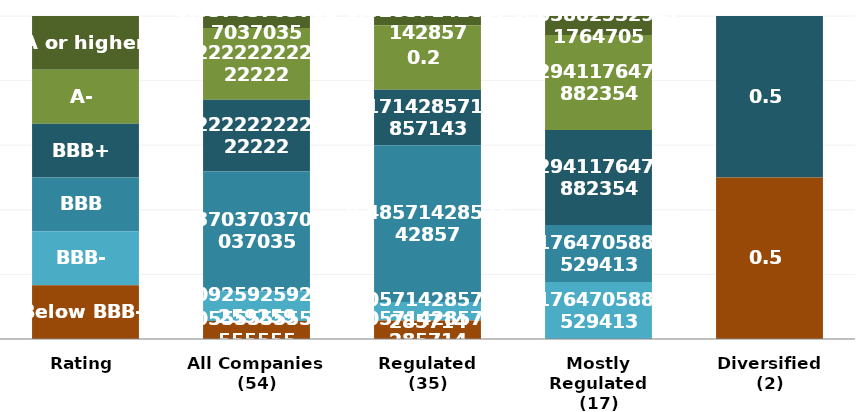
| Category | A or higher | A- | BBB+ | BBB | BBB- | Below BBB- |
|---|---|---|---|---|---|---|
| Rating | 1 | 1 | 1 | 1 | 1 | 1 |
| All Companies
(54) | 2 | 12 | 12 | 20 | 5 | 3 |
| Regulated
(35) | 1 | 7 | 6 | 17 | 2 | 2 |
| Mostly Regulated
(17) | 1 | 5 | 5 | 3 | 3 | 0 |
| Diversified
(2) | 0 | 0 | 1 | 0 | 0 | 1 |